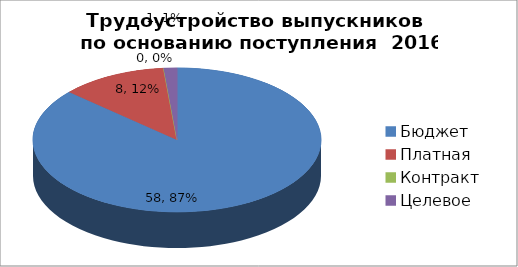
| Category | Series 0 |
|---|---|
| Бюджет | 58 |
| Платная | 8 |
| Контракт | 0 |
| Целевое | 1 |